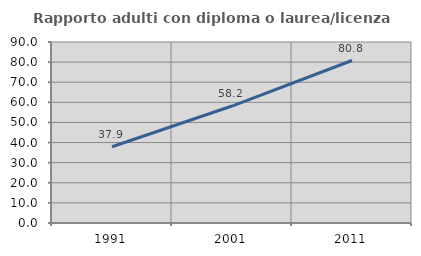
| Category | Rapporto adulti con diploma o laurea/licenza media  |
|---|---|
| 1991.0 | 37.908 |
| 2001.0 | 58.16 |
| 2011.0 | 80.798 |